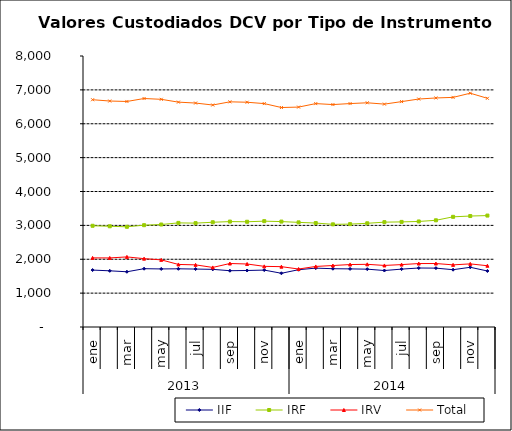
| Category | IIF | IRF | IRV | Total |
|---|---|---|---|---|
| 0 | 1680.741 | 2988.322 | 2040.209 | 6709.272 |
| 1900-01-01 | 1658.527 | 2973.343 | 2039.052 | 6670.922 |
| 1900-01-02 | 1630.445 | 2958.264 | 2068.804 | 6657.513 |
| 1900-01-03 | 1721.394 | 3005.99 | 2017.792 | 6745.176 |
| 1900-01-04 | 1713.796 | 3025.801 | 1981.652 | 6721.25 |
| 1900-01-05 | 1717.891 | 3073.578 | 1846.579 | 6638.048 |
| 1900-01-06 | 1710.542 | 3066.278 | 1834.309 | 6611.129 |
| 1900-01-07 | 1701.992 | 3092.176 | 1758.669 | 6552.838 |
| 1900-01-08 | 1661.332 | 3111.813 | 1874.421 | 6647.565 |
| 1900-01-09 | 1668.117 | 3106.907 | 1859.962 | 6634.986 |
| 1900-01-10 | 1680.246 | 3124.482 | 1790.218 | 6594.946 |
| 1900-01-11 | 1586.068 | 3111.888 | 1781.214 | 6479.17 |
| 1900-01-12 | 1691.285 | 3088.889 | 1711.633 | 6491.806 |
| 1900-01-13 | 1737.916 | 3069.015 | 1787.756 | 6594.688 |
| 1900-01-14 | 1720.613 | 3030.48 | 1814.882 | 6565.974 |
| 1900-01-15 | 1715.08 | 3037.042 | 1843.591 | 6595.713 |
| 1900-01-16 | 1707.126 | 3061.532 | 1850.323 | 6618.981 |
| 1900-01-17 | 1666.997 | 3095.162 | 1817.341 | 6579.5 |
| 1900-01-18 | 1708.543 | 3102.489 | 1842.196 | 6653.228 |
| 1900-01-19 | 1741.424 | 3115.318 | 1872.893 | 6729.634 |
| 1900-01-20 | 1737.987 | 3149.863 | 1873.636 | 6761.485 |
| 1900-01-21 | 1691.624 | 3252.67 | 1834.205 | 6778.499 |
| 1900-01-22 | 1762.551 | 3275.72 | 1863.237 | 6901.508 |
| 1900-01-23 | 1653.415 | 3289.364 | 1808.275 | 6751.054 |